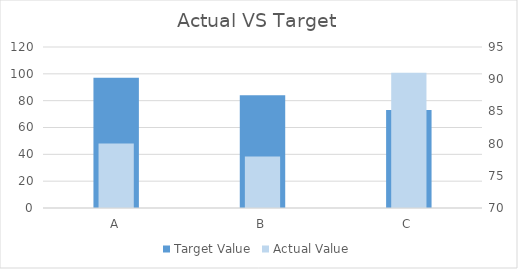
| Category | Target Value |
|---|---|
| A | 97 |
| B | 84 |
| C | 73 |